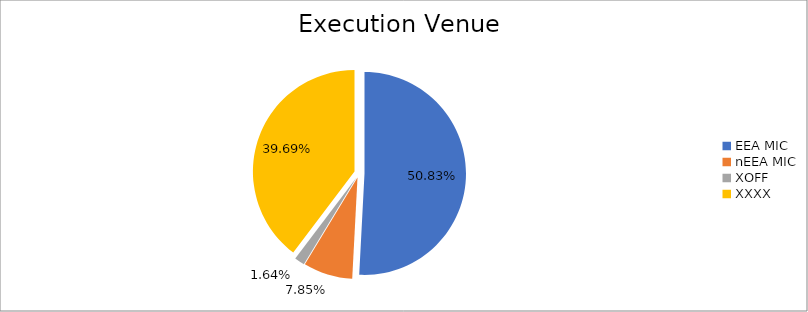
| Category | Series 0 |
|---|---|
| EEA MIC | 5511815.301 |
| nEEA MIC | 850744.615 |
| XOFF | 177631.691 |
| XXXX | 4303685.323 |